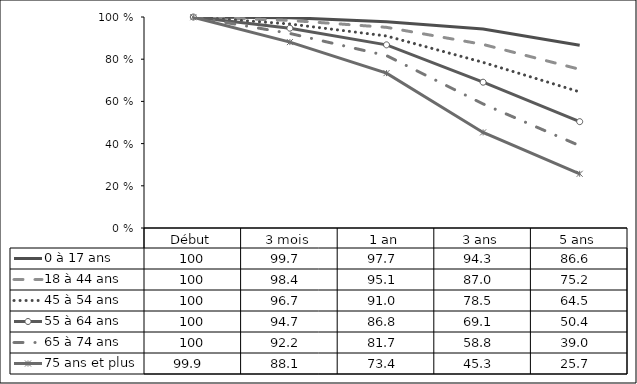
| Category | 0 à 17 ans | 18 à 44 ans  | 45 à 54 ans  | 55 à 64 ans  | 65 à 74 ans  | 75 ans et plus  |
|---|---|---|---|---|---|---|
| Début | 100 | 100 | 100 | 100 | 100 | 99.9 |
| 3 mois | 99.7 | 98.4 | 96.7 | 94.7 | 92.2 | 88.1 |
| 1 an | 97.7 | 95.1 | 91 | 86.8 | 81.7 | 73.4 |
| 3 ans | 94.3 | 87 | 78.5 | 69.1 | 58.8 | 45.3 |
| 5 ans | 86.6 | 75.2 | 64.5 | 50.4 | 39 | 25.7 |